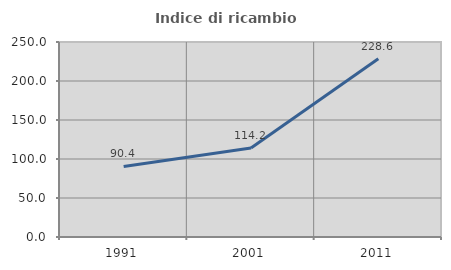
| Category | Indice di ricambio occupazionale  |
|---|---|
| 1991.0 | 90.444 |
| 2001.0 | 114.159 |
| 2011.0 | 228.614 |